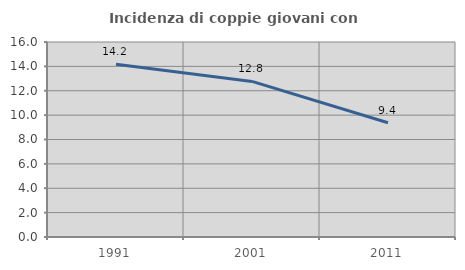
| Category | Incidenza di coppie giovani con figli |
|---|---|
| 1991.0 | 14.182 |
| 2001.0 | 12.767 |
| 2011.0 | 9.374 |